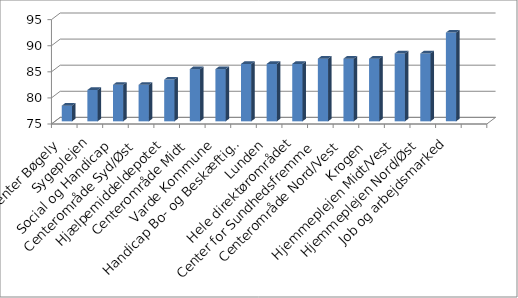
| Category | Series 0 |
|---|---|
| Center Bøgely | 78 |
| Sygeplejen | 81 |
| Social og Handicap | 82 |
| Centerområde Syd/Øst | 82 |
| Hjælpemiddeldepotet | 83 |
| Centerområde Midt | 85 |
| Varde Kommune | 85 |
| Handicap Bo- og Beskæftigelse | 86 |
| Lunden | 86 |
| Hele direktørområdet | 86 |
| Center for Sundhedsfremme | 87 |
| Centerområde Nord/Vest | 87 |
| Krogen  | 87 |
| Hjemmeplejen Midt/Vest | 88 |
| Hjemmeplejen Nord/Øst | 88 |
| Job og arbejdsmarked | 92 |